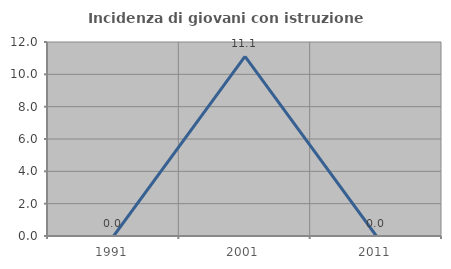
| Category | Incidenza di giovani con istruzione universitaria |
|---|---|
| 1991.0 | 0 |
| 2001.0 | 11.111 |
| 2011.0 | 0 |